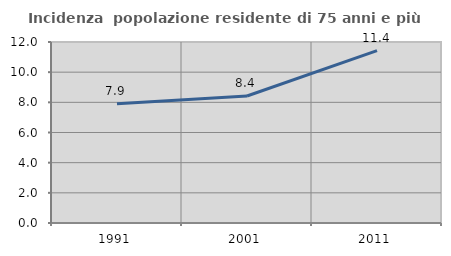
| Category | Incidenza  popolazione residente di 75 anni e più |
|---|---|
| 1991.0 | 7.913 |
| 2001.0 | 8.421 |
| 2011.0 | 11.423 |